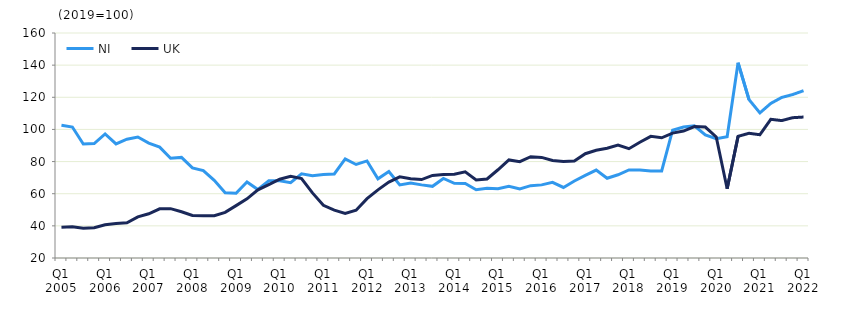
| Category | NI | UK  |
|---|---|---|
| Q1 2005 | 102.6 | 39.1 |
|  | 101.5 | 39.4 |
| Q3 2005 | 90.9 | 38.5 |
|  | 91.2 | 38.8 |
| Q1 2006 | 97.2 | 40.7 |
|  | 91 | 41.5 |
| Q3 2006 | 93.9 | 41.9 |
|  | 95.3 | 45.6 |
| Q1 2007 | 91.5 | 47.5 |
|  | 89 | 50.6 |
| Q3 2007 | 82.1 | 50.7 |
|  | 82.6 | 48.8 |
| Q1 2008 | 76.1 | 46.5 |
|  | 74.4 | 46.3 |
| Q3 2008 | 68.3 | 46.3 |
|  | 60.6 | 48.4 |
| Q1 2009 | 60.3 | 52.6 |
|  | 67.3 | 56.8 |
| Q3 2009 | 62.6 | 62.4 |
|  | 68 | 65.7 |
| Q1 2010 | 68.1 | 69 |
|  | 66.9 | 70.8 |
| Q3 2010 | 72.4 | 69.4 |
|  | 71.2 | 60.5 |
| Q1 2011 | 71.9 | 52.8 |
|  | 72.3 | 49.8 |
| Q3 2011 | 81.7 | 47.8 |
|  | 78.2 | 49.7 |
| Q1 2012 | 80.4 | 56.9 |
|  | 69.3 | 62.4 |
| Q3 2012 | 73.8 | 67.2 |
|  | 65.5 | 70.5 |
| Q1 2013 | 66.7 | 69.3 |
|  | 65.5 | 68.8 |
| Q3 2013 | 64.6 | 71.4 |
|  | 69.5 | 72 |
| Q1 2014 | 66.5 | 72.1 |
|  | 66.4 | 73.6 |
| Q3 2014 | 62.5 | 68.6 |
|  | 63.4 | 69.2 |
| Q1 2015 | 63.1 | 74.9 |
|  | 64.6 | 81 |
| Q3 2015 | 62.9 | 79.9 |
|  | 65 | 83 |
| Q1 2016 | 65.5 | 82.6 |
|  | 67.1 | 80.7 |
| Q3 2016 | 63.9 | 80.1 |
|  | 67.9 | 80.3 |
| Q1 2017 | 71.4 | 84.9 |
|  | 74.7 | 87 |
| Q3 2017 | 69.6 | 88.3 |
|  | 71.8 | 90.2 |
| Q1 2018 | 74.8 | 88 |
|  | 74.7 | 92 |
| Q3 2018 | 74.1 | 95.7 |
|  | 74.2 | 94.8 |
| Q1 2019 | 99.5 | 97.7 |
|  | 101.5 | 99 |
| Q3 2019 | 102.3 | 101.8 |
|  | 96.6 | 101.5 |
| Q1 2020 | 94.2 | 95.3 |
|  | 95.4 | 63.1 |
| Q3 2020 | 141.5 | 95.7 |
|  | 118.6 | 97.6 |
| Q1 2021 | 110.3 | 96.7 |
|  | 116.2 | 106.3 |
| Q3 2021 | 119.9 | 105.5 |
|  | 121.7 | 107.3 |
| Q1 2022 | 124.1 | 107.7 |